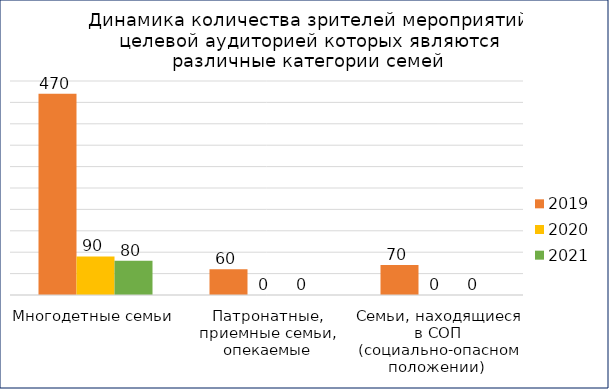
| Category | 2019 | 2020 | 2021 |
|---|---|---|---|
| Многодетные семьи  | 470 | 90 | 80 |
| Патронатные, приемные семьи, опекаемые | 60 | 0 | 0 |
| Семьи, находящиеся в СОП (социально-опасном положении)  | 70 | 0 | 0 |